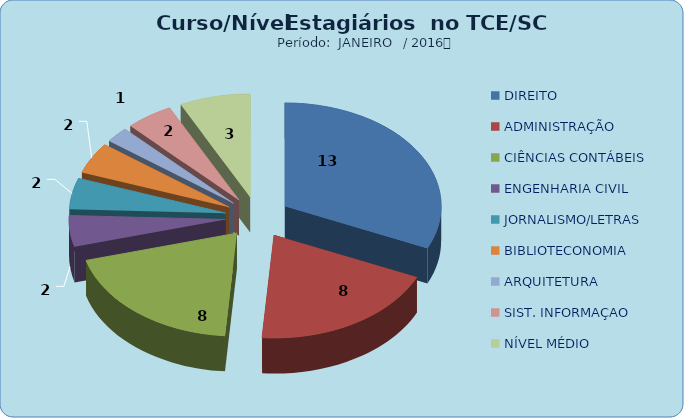
| Category | Series 0 |
|---|---|
| DIREITO | 13 |
| ADMINISTRAÇÃO | 8 |
| CIÊNCIAS CONTÁBEIS | 8 |
| ENGENHARIA CIVIL | 2 |
| JORNALISMO/LETRAS | 2 |
| BIBLIOTECONOMIA | 2 |
| ARQUITETURA | 1 |
| SIST. INFORMAÇAO | 2 |
| NÍVEL MÉDIO | 3 |